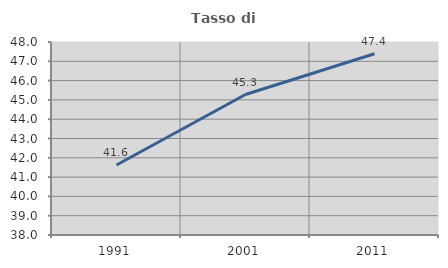
| Category | Tasso di occupazione   |
|---|---|
| 1991.0 | 41.624 |
| 2001.0 | 45.278 |
| 2011.0 | 47.391 |